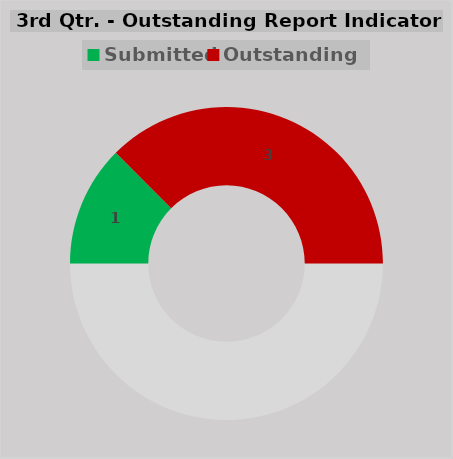
| Category | Series 0 |
|---|---|
|  | 4 |
| Submitted | 1 |
| Outstanding | 3 |